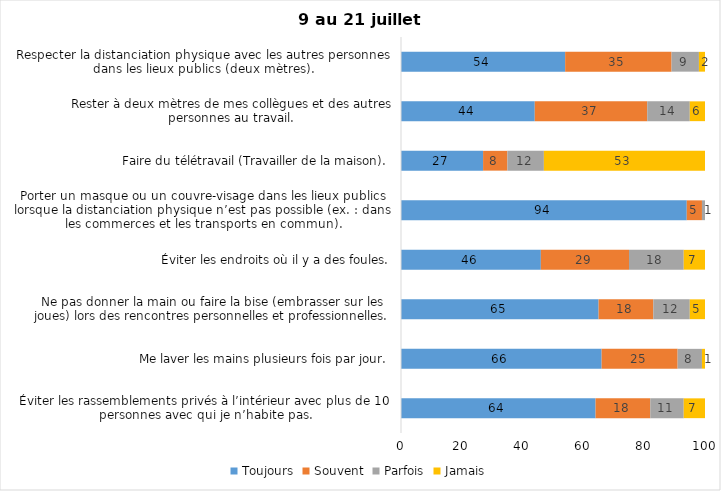
| Category | Toujours | Souvent | Parfois | Jamais |
|---|---|---|---|---|
| Éviter les rassemblements privés à l’intérieur avec plus de 10 personnes avec qui je n’habite pas. | 64 | 18 | 11 | 7 |
| Me laver les mains plusieurs fois par jour. | 66 | 25 | 8 | 1 |
| Ne pas donner la main ou faire la bise (embrasser sur les joues) lors des rencontres personnelles et professionnelles. | 65 | 18 | 12 | 5 |
| Éviter les endroits où il y a des foules. | 46 | 29 | 18 | 7 |
| Porter un masque ou un couvre-visage dans les lieux publics lorsque la distanciation physique n’est pas possible (ex. : dans les commerces et les transports en commun). | 94 | 5 | 1 | 0 |
| Faire du télétravail (Travailler de la maison). | 27 | 8 | 12 | 53 |
| Rester à deux mètres de mes collègues et des autres personnes au travail. | 44 | 37 | 14 | 6 |
| Respecter la distanciation physique avec les autres personnes dans les lieux publics (deux mètres). | 54 | 35 | 9 | 2 |